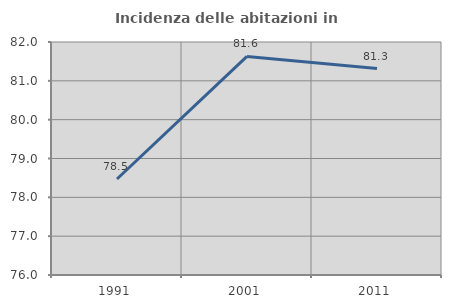
| Category | Incidenza delle abitazioni in proprietà  |
|---|---|
| 1991.0 | 78.471 |
| 2001.0 | 81.629 |
| 2011.0 | 81.316 |